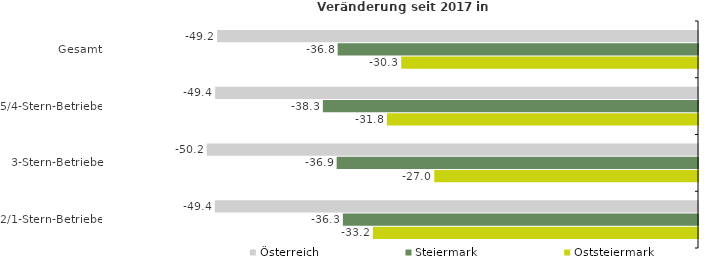
| Category | Österreich | Steiermark | Oststeiermark |
|---|---|---|---|
| Gesamt | -49.154 | -36.835 | -30.335 |
| 5/4-Stern-Betriebe | -49.355 | -38.346 | -31.806 |
| 3-Stern-Betriebe | -50.222 | -36.936 | -26.96 |
| 2/1-Stern-Betriebe | -49.399 | -36.296 | -33.237 |